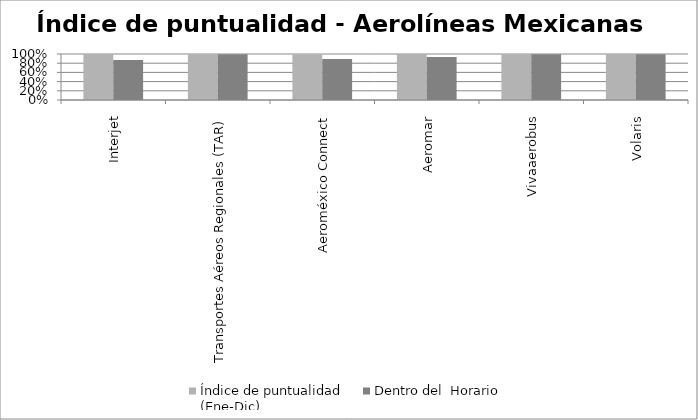
| Category | Índice de puntualidad
(Ene-Dic) | Dentro del  Horario |
|---|---|---|
| Interjet | 0.999 | 0.872 |
| Transportes Aéreos Regionales (TAR) | 0.994 | 0.994 |
| Aeroméxico Connect | 0.991 | 0.892 |
| Aeromar | 0.999 | 0.935 |
| Vivaaerobus | 0.994 | 0.993 |
| Volaris | 0.998 | 0.994 |